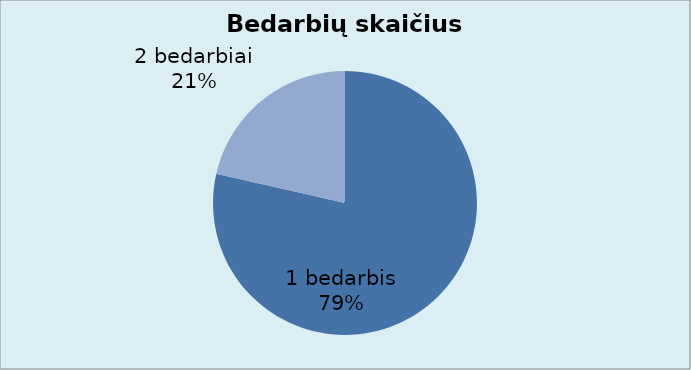
| Category | Series 0 |
|---|---|
| 1 bedarbis | 11 |
| 2 bedarbiai | 3 |